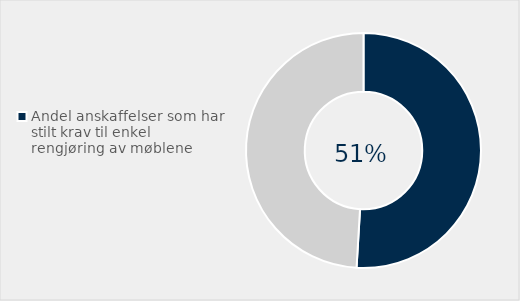
| Category | Series 0 |
|---|---|
| Andel anskaffelser som har stilt krav til enkel rengjøring av møblene | 0.509 |
| Ikke stilt krav | 0.491 |